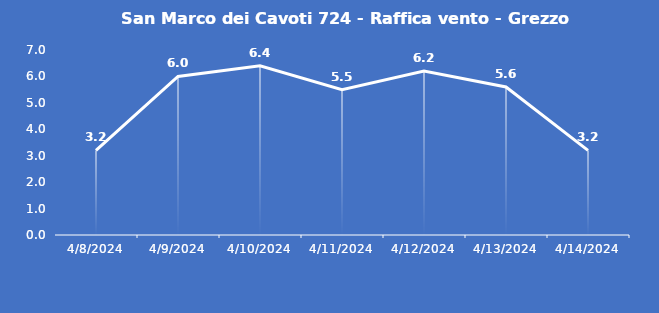
| Category | San Marco dei Cavoti 724 - Raffica vento - Grezzo (m/s) |
|---|---|
| 4/8/24 | 3.2 |
| 4/9/24 | 6 |
| 4/10/24 | 6.4 |
| 4/11/24 | 5.5 |
| 4/12/24 | 6.2 |
| 4/13/24 | 5.6 |
| 4/14/24 | 3.2 |